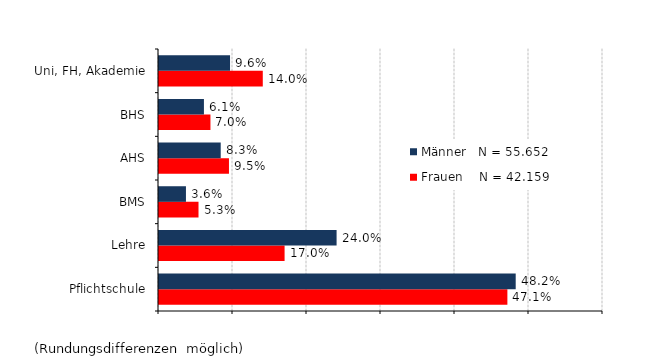
| Category | Frauen    N = 42.159 | Männer   N = 55.652 |
|---|---|---|
| Pflichtschule | 0.471 | 0.482 |
| Lehre | 0.17 | 0.24 |
| BMS | 0.053 | 0.036 |
| AHS | 0.095 | 0.083 |
| BHS | 0.07 | 0.061 |
| Uni, FH, Akademie | 0.14 | 0.096 |